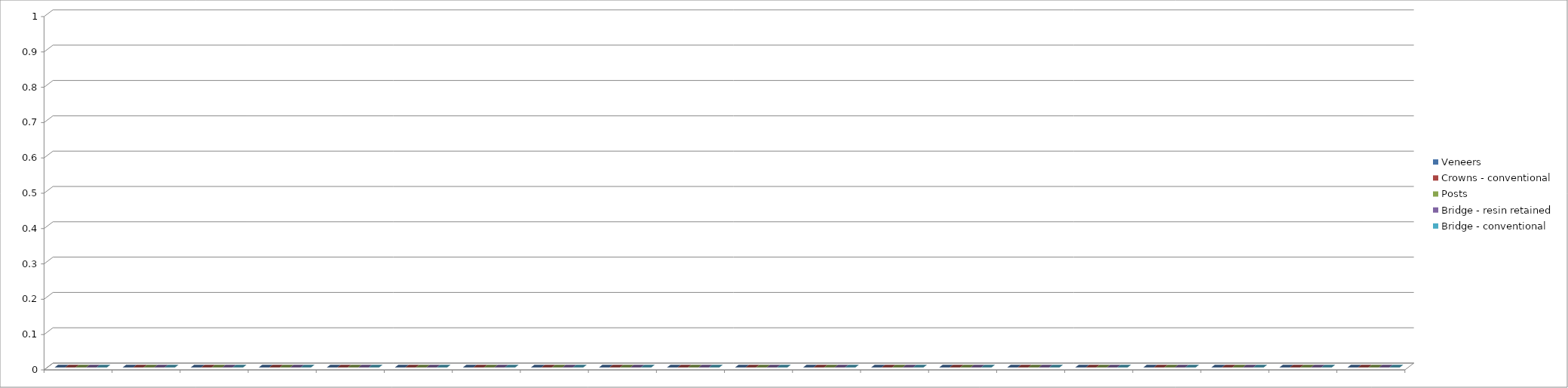
| Category | Veneers | Crowns - conventional | Posts | Bridge - resin retained | Bridge - conventional |
|---|---|---|---|---|---|
| 0 | 0 | 0 | 0 | 0 | 0 |
| 1 | 0 | 0 | 0 | 0 | 0 |
| 2 | 0 | 0 | 0 | 0 | 0 |
| 3 | 0 | 0 | 0 | 0 | 0 |
| 4 | 0 | 0 | 0 | 0 | 0 |
| 5 | 0 | 0 | 0 | 0 | 0 |
| 6 | 0 | 0 | 0 | 0 | 0 |
| 7 | 0 | 0 | 0 | 0 | 0 |
| 8 | 0 | 0 | 0 | 0 | 0 |
| 9 | 0 | 0 | 0 | 0 | 0 |
| 10 | 0 | 0 | 0 | 0 | 0 |
| 11 | 0 | 0 | 0 | 0 | 0 |
| 12 | 0 | 0 | 0 | 0 | 0 |
| 13 | 0 | 0 | 0 | 0 | 0 |
| 14 | 0 | 0 | 0 | 0 | 0 |
| 15 | 0 | 0 | 0 | 0 | 0 |
| 16 | 0 | 0 | 0 | 0 | 0 |
| 17 | 0 | 0 | 0 | 0 | 0 |
| 18 | 0 | 0 | 0 | 0 | 0 |
| 19 | 0 | 0 | 0 | 0 | 0 |